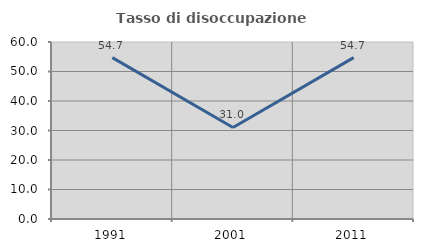
| Category | Tasso di disoccupazione giovanile  |
|---|---|
| 1991.0 | 54.706 |
| 2001.0 | 31.034 |
| 2011.0 | 54.688 |